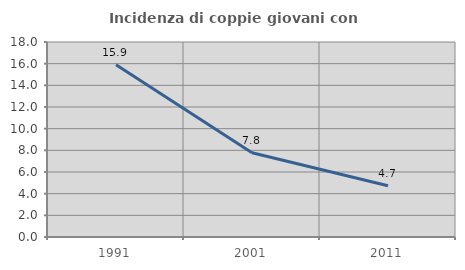
| Category | Incidenza di coppie giovani con figli |
|---|---|
| 1991.0 | 15.896 |
| 2001.0 | 7.771 |
| 2011.0 | 4.73 |